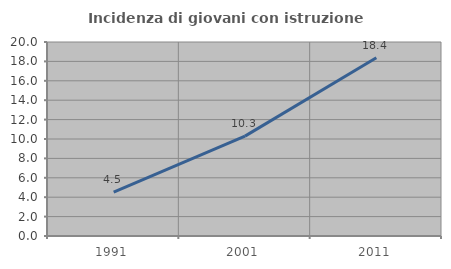
| Category | Incidenza di giovani con istruzione universitaria |
|---|---|
| 1991.0 | 4.511 |
| 2001.0 | 10.294 |
| 2011.0 | 18.378 |